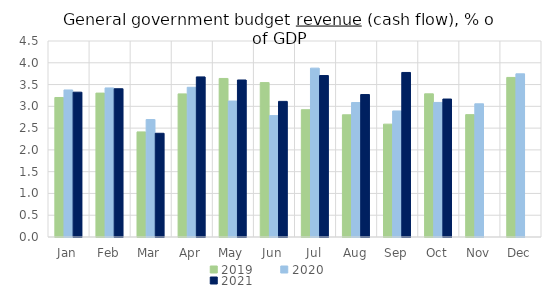
| Category | 2019 | 2020 | 2021 |
|---|---|---|---|
| Jan | 3.203 | 3.376 | 3.325 |
| Feb | 3.304 | 3.423 | 3.404 |
| Mar | 2.413 | 2.696 | 2.382 |
| Apr | 3.286 | 3.437 | 3.676 |
| May | 3.64 | 3.122 | 3.605 |
| Jun | 3.545 | 2.787 | 3.114 |
| Jul | 2.922 | 3.877 | 3.707 |
| Aug | 2.805 | 3.087 | 3.27 |
| Sep | 2.591 | 2.894 | 3.778 |
| Oct | 3.287 | 3.089 | 3.167 |
| Nov | 2.809 | 3.058 | 0 |
| Dec | 3.664 | 3.746 | 0 |